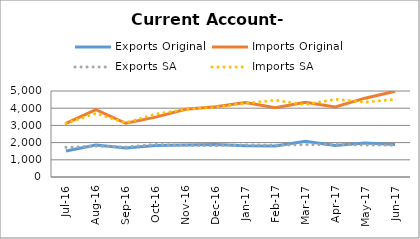
| Category | Exports Original | Imports Original | Exports SA | Imports SA |
|---|---|---|---|---|
| 2016-07-11 | 1508 | 3119 | 1723 | 3117 |
| 2016-08-11 | 1857 | 3916 | 1795 | 3702 |
| 2016-09-11 | 1689 | 3125 | 1744 | 3150 |
| 2016-10-11 | 1826 | 3482 | 1895 | 3661 |
| 2016-11-11 | 1860 | 3940 | 1832 | 3931 |
| 2016-12-11 | 1891 | 4082 | 1819 | 4056 |
| 2017-01-11 | 1811 | 4327 | 1868 | 4288 |
| 2017-02-11 | 1797 | 4021 | 1853 | 4461 |
| 2017-03-11 | 2075 | 4348 | 1881 | 4208 |
| 2017-04-11 | 1827 | 4072 | 1891 | 4519 |
| 2017-05-11 | 1978 | 4583 | 1862 | 4353 |
| 2017-06-11 | 1884 | 4986 | 1845 | 4515 |